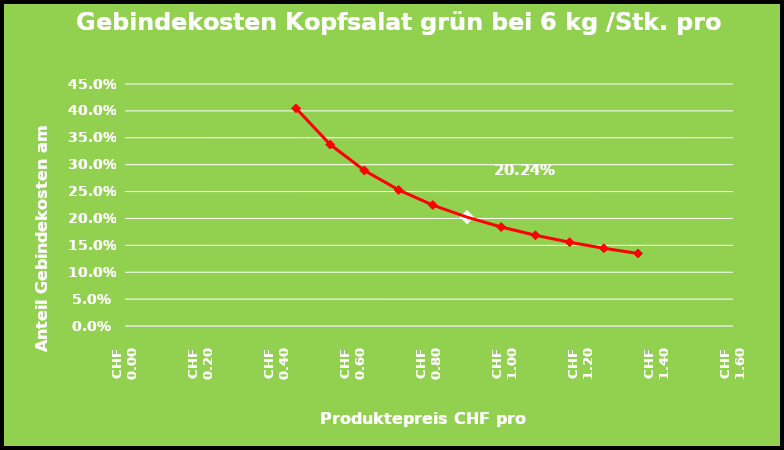
| Category | IFCO 6416 grün |
|---|---|
| 0.45 | 0.405 |
| 0.54 | 0.337 |
| 0.63 | 0.289 |
| 0.72 | 0.253 |
| 0.81 | 0.225 |
| 0.9 | 0.202 |
| 0.99 | 0.184 |
| 1.08 | 0.169 |
| 1.17 | 0.156 |
| 1.26 | 0.145 |
| 1.35 | 0.135 |